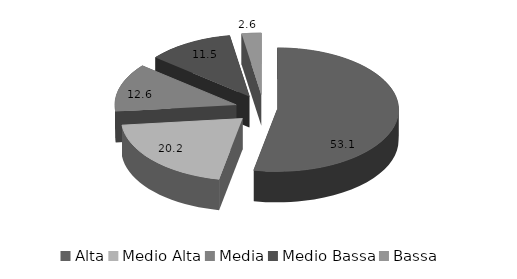
| Category | Series 0 |
|---|---|
| Alta | 53.1 |
| Medio Alta | 20.2 |
| Media | 12.6 |
| Medio Bassa | 11.5 |
| Bassa | 2.6 |